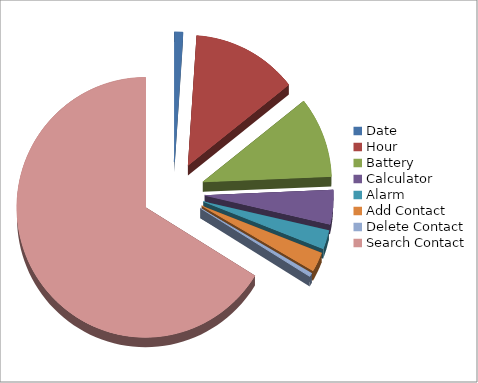
| Category | TASKS |
|---|---|
| Date | 0.792 |
| Hour | 9.813 |
| Battery | 7.397 |
| Calculator | 3.141 |
| Alarm | 1.732 |
| Add Contact | 1.785 |
| Delete Contact | 0.349 |
| Search Contact | 48.973 |